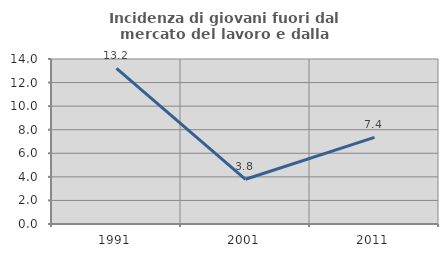
| Category | Incidenza di giovani fuori dal mercato del lavoro e dalla formazione  |
|---|---|
| 1991.0 | 13.209 |
| 2001.0 | 3.794 |
| 2011.0 | 7.353 |